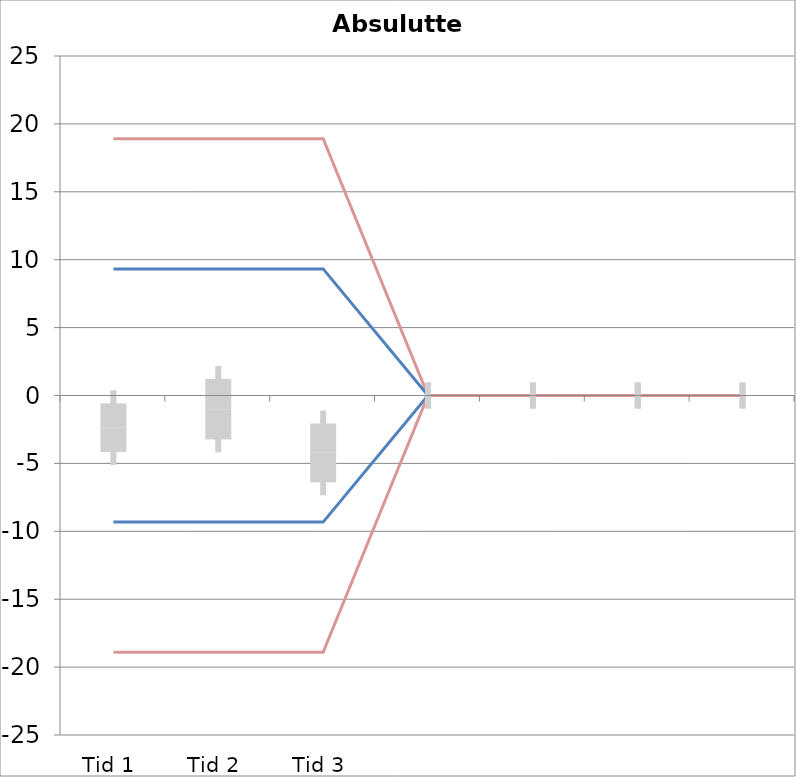
| Category | 1 | 2 | 3 | 4 | 5 | 6 | 7 | 8 | 9 | 10 | 11 | 12 | 13 | 14 | 15 | 16 | 17 | 18 | 19 | 20 | TEa | B | -B | -TEa | M |
|---|---|---|---|---|---|---|---|---|---|---|---|---|---|---|---|---|---|---|---|---|---|---|---|---|---|
| Tid 1 | -5.4 | -5.5 | -7.5 | -3.2 | -0.5 | 0 | -3 | 1.1 | -1.7 | -3.7 | 1.3 | -0.3 | 0 | 0 | 0 | 0 | 0 | 0 | 0 | 0 | 18.913 | 9.322 | -9.322 | -18.913 | -2.367 |
| Tid 2 | -6.1 | 1.3 | -0.8 | 3.5 | 6.3 | -3.2 | -0.3 | -2.5 | -3.9 | -4.7 | -0.6 | -1.1 | 0 | 0 | 0 | 0 | 0 | 0 | 0 | 0 | 18.913 | 9.322 | -9.322 | -18.913 | -1.008 |
| Tid 3 | -6.4 | -8.7 | -9.1 | -3.9 | -0.1 | 0.5 | -4.3 | -3 | -9.1 | -2.5 | -1 | -3.1 | 0 | 0 | 0 | 0 | 0 | 0 | 0 | 0 | 18.913 | 9.322 | -9.322 | -18.913 | -4.225 |